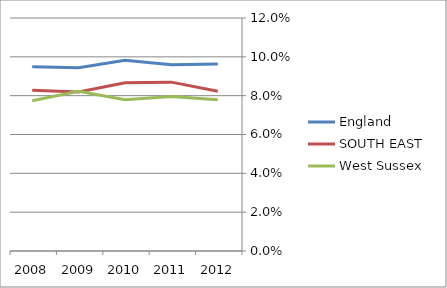
| Category | England | SOUTH EAST  | West Sussex |
|---|---|---|---|
| 2012.0 | 0.096 | 0.082 | 0.078 |
| 2011.0 | 0.096 | 0.087 | 0.08 |
| 2010.0 | 0.098 | 0.087 | 0.078 |
| 2009.0 | 0.094 | 0.082 | 0.082 |
| 2008.0 | 0.095 | 0.083 | 0.077 |